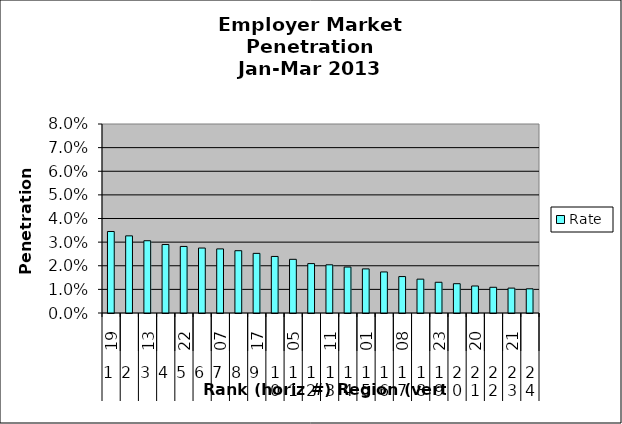
| Category | Rate |
|---|---|
| 0 | 0.034 |
| 1 | 0.033 |
| 2 | 0.031 |
| 3 | 0.029 |
| 4 | 0.028 |
| 5 | 0.027 |
| 6 | 0.027 |
| 7 | 0.026 |
| 8 | 0.025 |
| 9 | 0.024 |
| 10 | 0.023 |
| 11 | 0.021 |
| 12 | 0.02 |
| 13 | 0.019 |
| 14 | 0.019 |
| 15 | 0.017 |
| 16 | 0.015 |
| 17 | 0.014 |
| 18 | 0.013 |
| 19 | 0.012 |
| 20 | 0.011 |
| 21 | 0.011 |
| 22 | 0.011 |
| 23 | 0.01 |